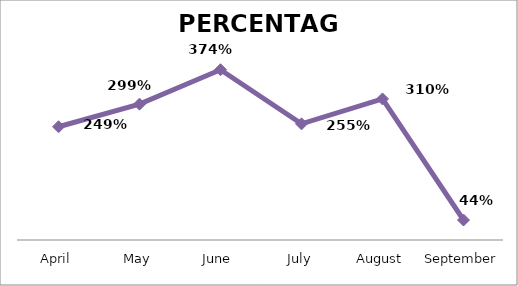
| Category | PERCENTAGE |
|---|---|
| April | 2.489 |
| May | 2.986 |
| June | 3.742 |
| July | 2.554 |
| August | 3.1 |
| September | 0.439 |